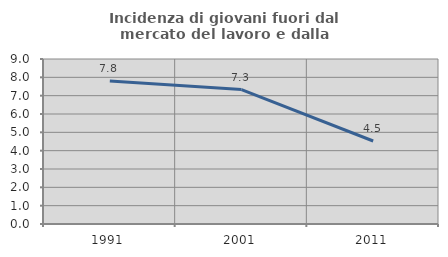
| Category | Incidenza di giovani fuori dal mercato del lavoro e dalla formazione  |
|---|---|
| 1991.0 | 7.799 |
| 2001.0 | 7.333 |
| 2011.0 | 4.528 |